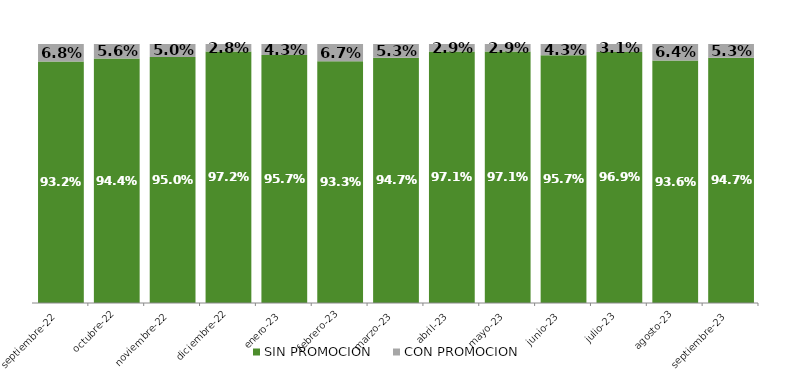
| Category | SIN PROMOCION   | CON PROMOCION   |
|---|---|---|
| 2022-09-01 | 0.932 | 0.068 |
| 2022-10-01 | 0.944 | 0.056 |
| 2022-11-01 | 0.95 | 0.05 |
| 2022-12-01 | 0.972 | 0.028 |
| 2023-01-01 | 0.957 | 0.043 |
| 2023-02-01 | 0.933 | 0.067 |
| 2023-03-01 | 0.947 | 0.053 |
| 2023-04-01 | 0.971 | 0.029 |
| 2023-05-01 | 0.971 | 0.029 |
| 2023-06-01 | 0.957 | 0.043 |
| 2023-07-01 | 0.969 | 0.031 |
| 2023-08-01 | 0.936 | 0.064 |
| 2023-09-01 | 0.947 | 0.053 |